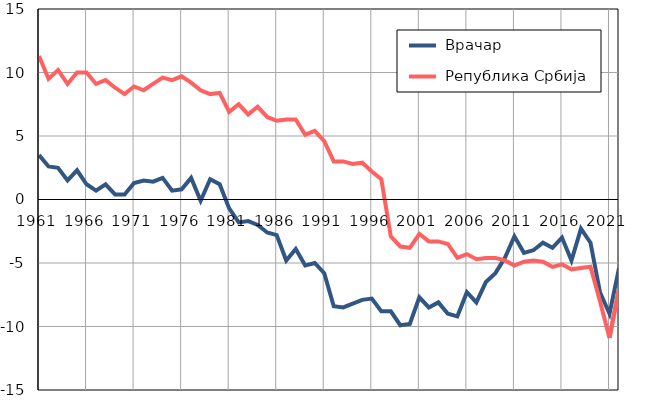
| Category |  Врачар |  Република Србија |
|---|---|---|
| 1961.0 | 3.5 | 11.3 |
| 1962.0 | 2.6 | 9.5 |
| 1963.0 | 2.5 | 10.2 |
| 1964.0 | 1.5 | 9.1 |
| 1965.0 | 2.3 | 10 |
| 1966.0 | 1.2 | 10 |
| 1967.0 | 0.7 | 9.1 |
| 1968.0 | 1.2 | 9.4 |
| 1969.0 | 0.4 | 8.8 |
| 1970.0 | 0.4 | 8.3 |
| 1971.0 | 1.3 | 8.9 |
| 1972.0 | 1.5 | 8.6 |
| 1973.0 | 1.4 | 9.1 |
| 1974.0 | 1.7 | 9.6 |
| 1975.0 | 0.7 | 9.4 |
| 1976.0 | 0.8 | 9.7 |
| 1977.0 | 1.7 | 9.2 |
| 1978.0 | -0.1 | 8.6 |
| 1979.0 | 1.6 | 8.3 |
| 1980.0 | 1.2 | 8.4 |
| 1981.0 | -0.7 | 6.9 |
| 1982.0 | -1.8 | 7.5 |
| 1983.0 | -1.7 | 6.7 |
| 1984.0 | -2 | 7.3 |
| 1985.0 | -2.6 | 6.5 |
| 1986.0 | -2.8 | 6.2 |
| 1987.0 | -4.8 | 6.3 |
| 1988.0 | -3.9 | 6.3 |
| 1989.0 | -5.2 | 5.1 |
| 1990.0 | -5 | 5.4 |
| 1991.0 | -5.8 | 4.6 |
| 1992.0 | -8.4 | 3 |
| 1993.0 | -8.5 | 3 |
| 1994.0 | -8.2 | 2.8 |
| 1995.0 | -7.9 | 2.9 |
| 1996.0 | -7.8 | 2.2 |
| 1997.0 | -8.8 | 1.6 |
| 1998.0 | -8.8 | -2.9 |
| 1999.0 | -9.9 | -3.7 |
| 2000.0 | -9.8 | -3.8 |
| 2001.0 | -7.7 | -2.7 |
| 2002.0 | -8.5 | -3.3 |
| 2003.0 | -8.1 | -3.3 |
| 2004.0 | -9 | -3.5 |
| 2005.0 | -9.2 | -4.6 |
| 2006.0 | -7.3 | -4.3 |
| 2007.0 | -8.1 | -4.7 |
| 2008.0 | -6.5 | -4.6 |
| 2009.0 | -5.8 | -4.6 |
| 2010.0 | -4.6 | -4.8 |
| 2011.0 | -2.9 | -5.2 |
| 2012.0 | -4.2 | -4.9 |
| 2013.0 | -4 | -4.8 |
| 2014.0 | -3.4 | -4.9 |
| 2015.0 | -3.8 | -5.3 |
| 2016.0 | -3 | -5.1 |
| 2017.0 | -4.8 | -5.5 |
| 2018.0 | -2.3 | -5.4 |
| 2019.0 | -3.4 | -5.3 |
| 2020.0 | -7.3 | -8 |
| 2021.0 | -9 | -10.9 |
| 2022.0 | -5.4 | -7 |